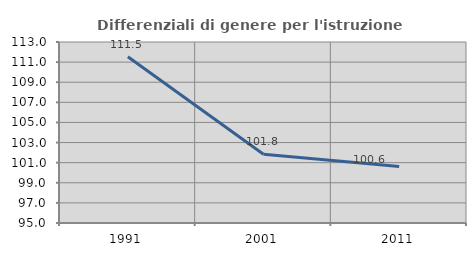
| Category | Differenziali di genere per l'istruzione superiore |
|---|---|
| 1991.0 | 111.528 |
| 2001.0 | 101.835 |
| 2011.0 | 100.614 |